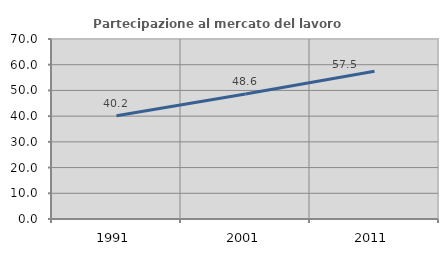
| Category | Partecipazione al mercato del lavoro  femminile |
|---|---|
| 1991.0 | 40.152 |
| 2001.0 | 48.589 |
| 2011.0 | 57.468 |